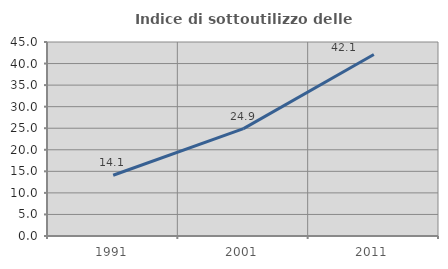
| Category | Indice di sottoutilizzo delle abitazioni  |
|---|---|
| 1991.0 | 14.09 |
| 2001.0 | 24.896 |
| 2011.0 | 42.112 |